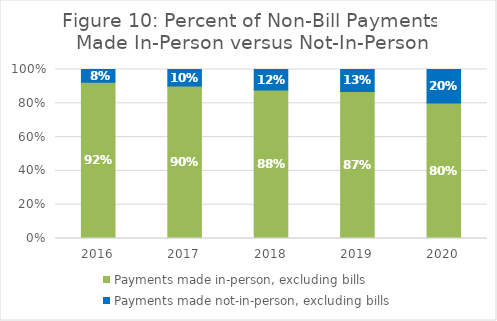
| Category | Payments made in-person, excluding bills | Payments made not-in-person, excluding bills |
|---|---|---|
| 2016.0 | 0.924 | 0.076 |
| 2017.0 | 0.903 | 0.097 |
| 2018.0 | 0.878 | 0.122 |
| 2019.0 | 0.87 | 0.13 |
| 2020.0 | 0.801 | 0.199 |